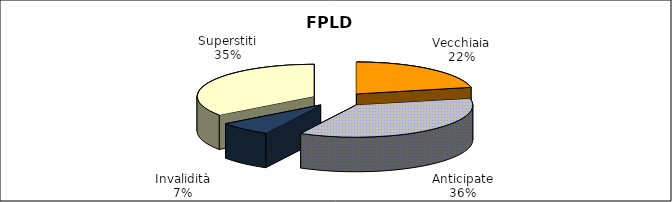
| Category | Series 0 |
|---|---|
| Vecchiaia | 73689 |
| Anticipate | 122546 |
| Invalidità | 24710 |
| Superstiti | 118771 |